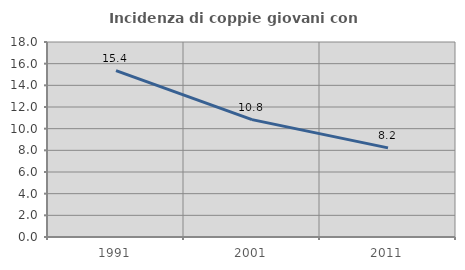
| Category | Incidenza di coppie giovani con figli |
|---|---|
| 1991.0 | 15.358 |
| 2001.0 | 10.833 |
| 2011.0 | 8.228 |